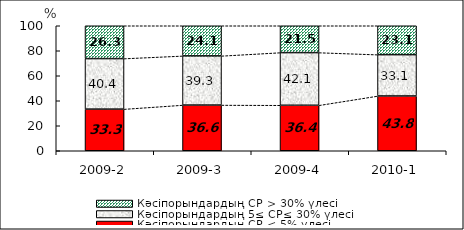
| Category | Кәсіпорындардың СР < 5% үлесі | Кәсіпорындардың 5≤ СР≤ 30% үлесі | Кәсіпорындардың СР > 30% үлесі |
|---|---|---|---|
| 2009-2 | 33.309 | 40.436 | 26.255 |
| 2009-3 | 36.551 | 39.334 | 24.115 |
| 2009-4 | 36.397 | 42.132 | 21.471 |
| 2010-1 | 43.821 | 33.055 | 23.124 |